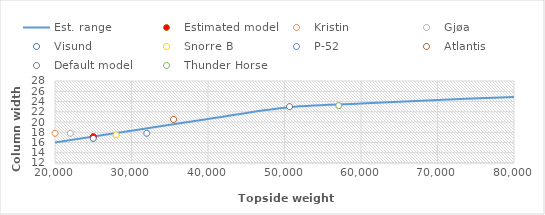
| Category | Est. range |
|---|---|
| 20000.0 | 16 |
| 30000.0 | 18.3 |
| 40000.0 | 20.6 |
| 50000.0 | 22.8 |
| 60000.0 | 23.6 |
| 70000.0 | 24.3 |
| 80000.0 | 24.9 |